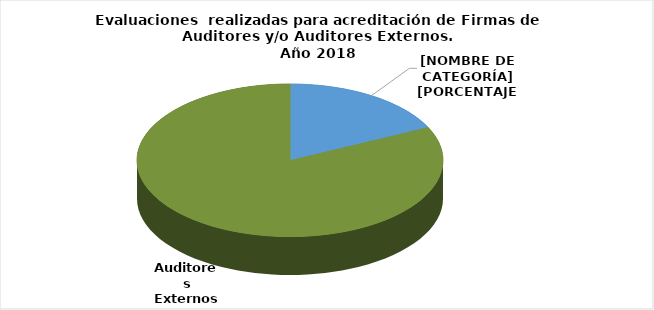
| Category | Series 0 |
|---|---|
| Firmas de Auditores Externos | 10 |
| Auditores Externos | 46 |